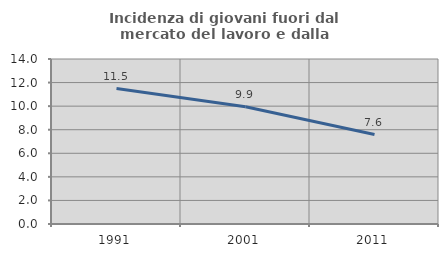
| Category | Incidenza di giovani fuori dal mercato del lavoro e dalla formazione  |
|---|---|
| 1991.0 | 11.49 |
| 2001.0 | 9.946 |
| 2011.0 | 7.593 |